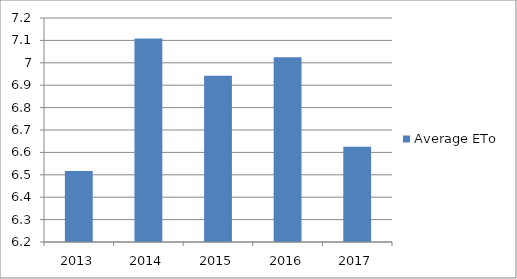
| Category | Average ETo |
|---|---|
| 2013.0 | 6.517 |
| 2014.0 | 7.108 |
| 2015.0 | 6.942 |
| 2016.0 | 7.025 |
| 2017.0 | 6.625 |